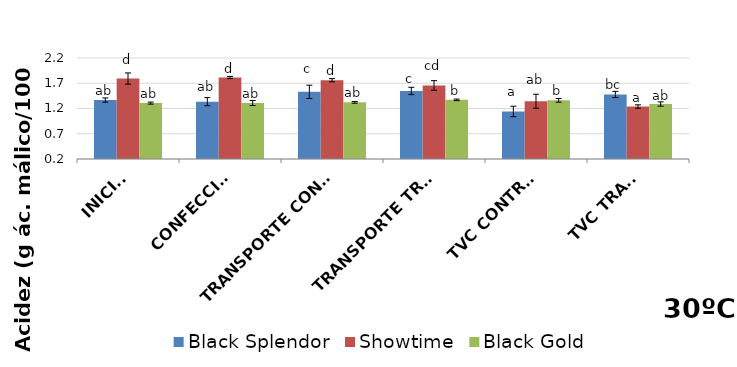
| Category | Black Splendor | Showtime | Black Gold |
|---|---|---|---|
| INICIAL | 1.367 | 1.793 | 1.307 |
| CONFECCIÓN | 1.336 | 1.813 | 1.309 |
|  TRANSPORTE CONTROL | 1.53 | 1.76 | 1.322 |
| TRANSPORTE TRAT. | 1.548 | 1.656 | 1.371 |
| TVC CONTROL | 1.141 | 1.344 | 1.362 |
| TVC TRAT. | 1.478 | 1.24 | 1.289 |